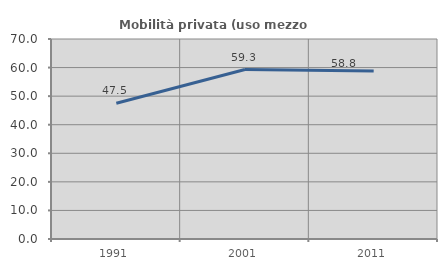
| Category | Mobilità privata (uso mezzo privato) |
|---|---|
| 1991.0 | 47.5 |
| 2001.0 | 59.308 |
| 2011.0 | 58.805 |